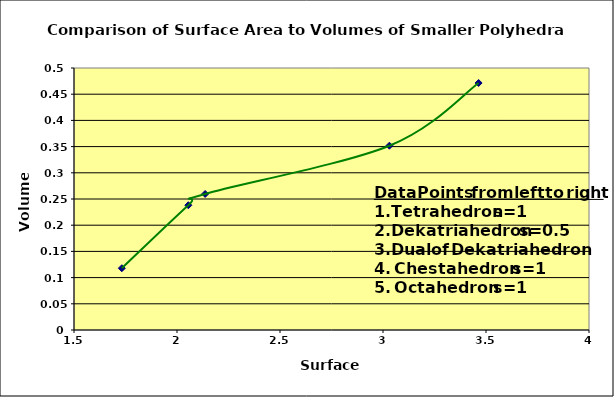
| Category | Series 0 |
|---|---|
| 1.73205 | 0.118 |
| 2.055106 | 0.238 |
| 2.136607 | 0.26 |
| 3.031091 | 0.352 |
| 3.4641 | 0.471 |